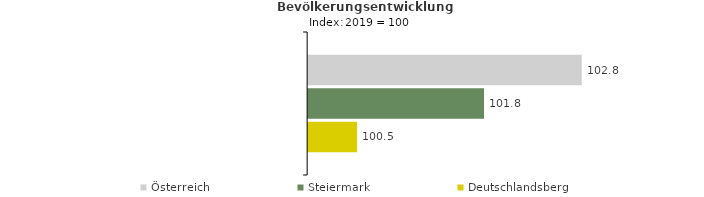
| Category | Österreich | Steiermark | Deutschlandsberg |
|---|---|---|---|
| 2023.0 | 102.8 | 101.8 | 100.5 |